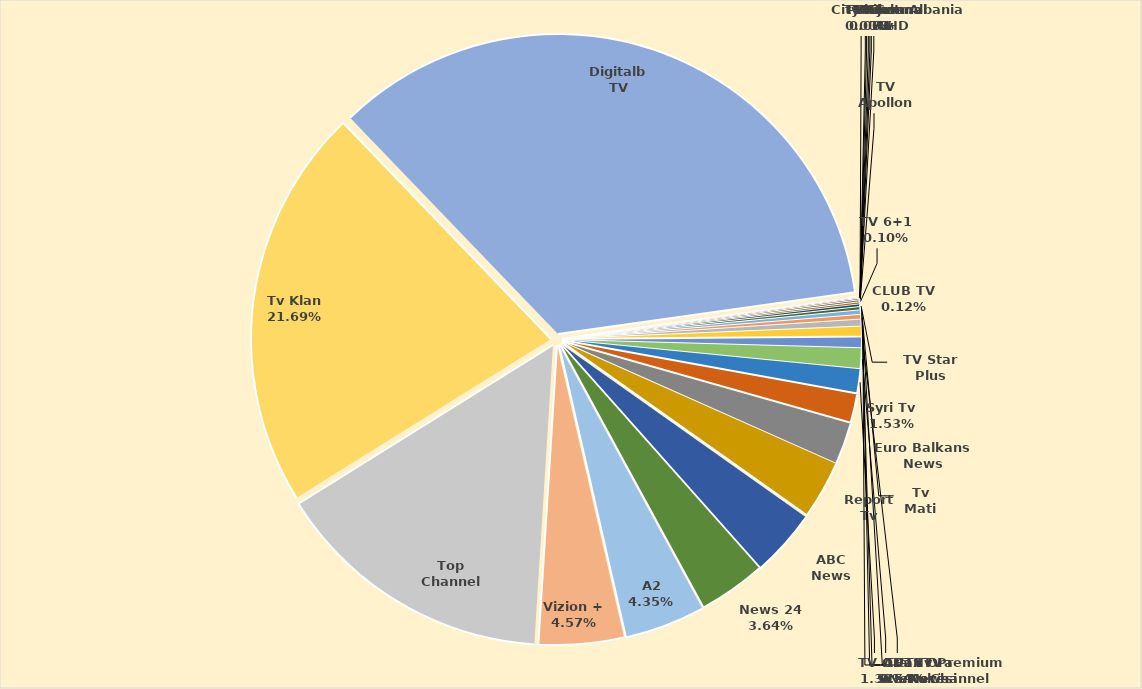
| Category | Revenues in 2022 |
|---|---|
| TVT | 0 |
| City News Albania HD | 0 |
| In Tv | 0 |
| Panorama Tv | 210242 |
| Shijak Tv | 347039 |
| TV Sot 7 | 1869101 |
| TV Channel 1 | 4605285 |
| TV Apollon | 8025222 |
| TV 6+1 | 9904980 |
| CLUB TV | 11307650 |
| TV Star Plus | 13464616 |
| Tv Mati | 16898946 |
| Tv Premium Channel | 22152200 |
| TV Kukësi | 24814278 |
| Tv Ora News | 35062900 |
| ADTN | 51151078 |
| Fax News | 53924547 |
| TV Scan | 106662878 |
| TV Ora | 124075035 |
| Syri Tv | 145982192 |
| Euro Balkans News | 216141281 |
| Report Tv | 299795327 |
| ABC News | 346698061 |
| News 24 | 346906821 |
| A2 | 414768795 |
| Vizion + | 436336452 |
| Top Channel | 1443417716 |
| Tv Klan  | 2068823675 |
| Digitalb TV | 3335297685 |